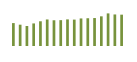
| Category | Saldo [ (1)-(2) ] |
|---|---|
| 0 | 532729.955 |
| 1 | 495602.949 |
| 2 | 464912.543 |
| 3 | 524886.84 |
| 4 | 575003.691 |
| 5 | 617133.535 |
| 6 | 598394.561 |
| 7 | 601130.812 |
| 8 | 618778.996 |
| 9 | 613783.089 |
| 10 | 640835.074 |
| 11 | 645614.486 |
| 12 | 650194 |
| 13 | 689934.963 |
| 14 | 758215.887 |
| 15 | 733619.613 |
| 16 | 728764.565 |